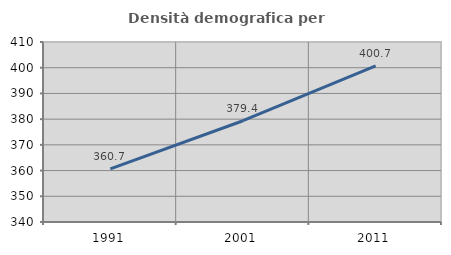
| Category | Densità demografica |
|---|---|
| 1991.0 | 360.663 |
| 2001.0 | 379.384 |
| 2011.0 | 400.709 |